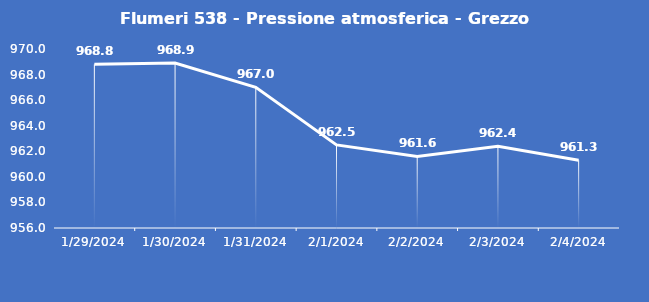
| Category | Flumeri 538 - Pressione atmosferica - Grezzo (hPa) |
|---|---|
| 1/29/24 | 968.8 |
| 1/30/24 | 968.9 |
| 1/31/24 | 967 |
| 2/1/24 | 962.5 |
| 2/2/24 | 961.6 |
| 2/3/24 | 962.4 |
| 2/4/24 | 961.3 |